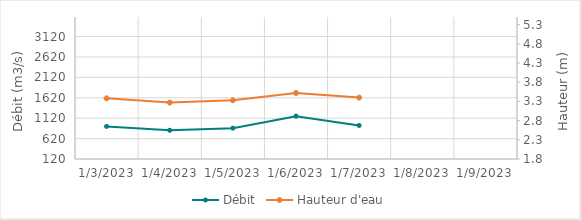
| Category | Débit |
|---|---|
| 4/26/22 | 2851.29 |
| 4/25/22 | 2939.17 |
| 4/24/22 | 3066.67 |
| 4/23/22 | 2890.6 |
| 4/22/22 | 2544.51 |
| 4/21/22 | 2377.31 |
| 4/20/22 | 2346.67 |